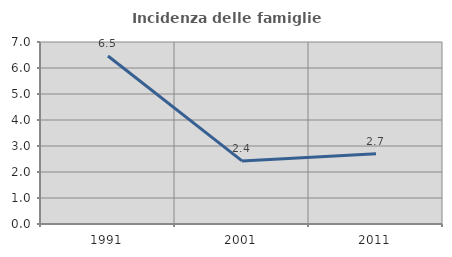
| Category | Incidenza delle famiglie numerose |
|---|---|
| 1991.0 | 6.46 |
| 2001.0 | 2.428 |
| 2011.0 | 2.703 |